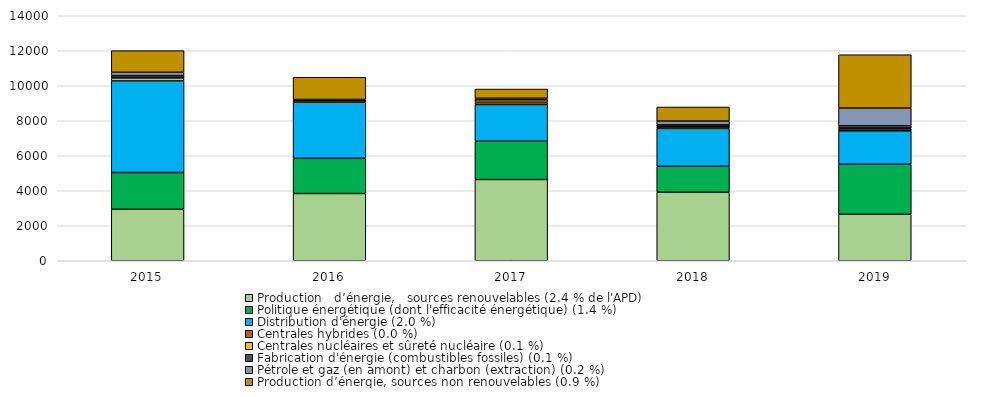
| Category | Production   d’énergie,   sources renouvelables (2.4 % de l'APD) | Politique énergétique (dont l'efficacité énergétique) (1.4 %) | Distribution d'énergie (2.0 %) | Centrales hybrides (0.0 %) | Centrales nucléaires et sûreté nucléaire (0.1 %) | Fabrication d'énergie (combustibles fossiles) (0.1 %) | Pétrole et gaz (en amont) et charbon (extraction) (0.2 %) | Production d’énergie, sources non renouvelables (0.9 %) |
|---|---|---|---|---|---|---|---|---|
| 2015 | 2940.868 | 2100.367 | 5234.013 | 0 | 171.242 | 131.926 | 192.869 | 1236.116 |
| 2016 | 3842.752 | 2010.37 | 3217.114 | 0.176 | 82.826 | 43.116 | 19.006 | 1271.982 |
| 2017 | 4643.575 | 2186.396 | 2097.788 | 130.375 | 148.014 | 1.612 | 76.685 | 527.38 |
| 2018 | 3922.718 | 1475.915 | 2162.988 | 18.138 | 75.367 | 111.169 | 215.968 | 803.978 |
| 2019 | 2657.072 | 2860.402 | 1908.312 | 115.186 | 40.825 | 124.825 | 1020.87 | 3045.843 |